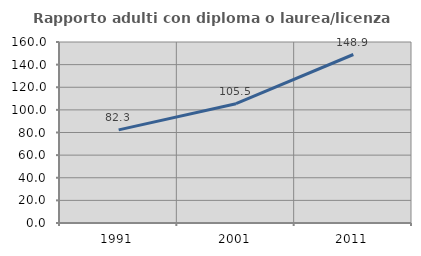
| Category | Rapporto adulti con diploma o laurea/licenza media  |
|---|---|
| 1991.0 | 82.333 |
| 2001.0 | 105.453 |
| 2011.0 | 148.947 |